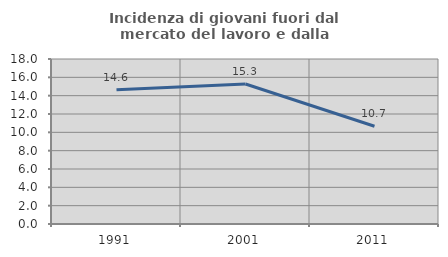
| Category | Incidenza di giovani fuori dal mercato del lavoro e dalla formazione  |
|---|---|
| 1991.0 | 14.634 |
| 2001.0 | 15.278 |
| 2011.0 | 10.667 |